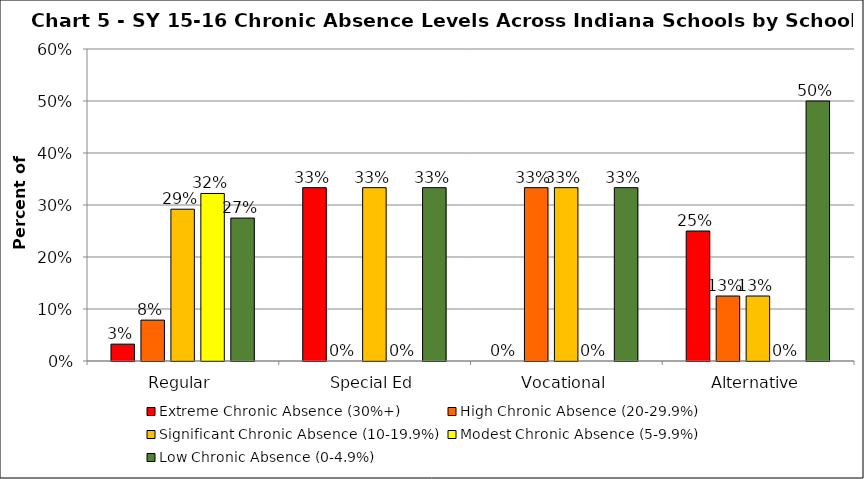
| Category | Extreme Chronic Absence (30%+) | High Chronic Absence (20-29.9%) | Significant Chronic Absence (10-19.9%) | Modest Chronic Absence (5-9.9%) | Low Chronic Absence (0-4.9%) |
|---|---|---|---|---|---|
| 0 | 0.032 | 0.079 | 0.292 | 0.322 | 0.275 |
| 1 | 0.333 | 0 | 0.333 | 0 | 0.333 |
| 2 | 0 | 0.333 | 0.333 | 0 | 0.333 |
| 3 | 0.25 | 0.125 | 0.125 | 0 | 0.5 |